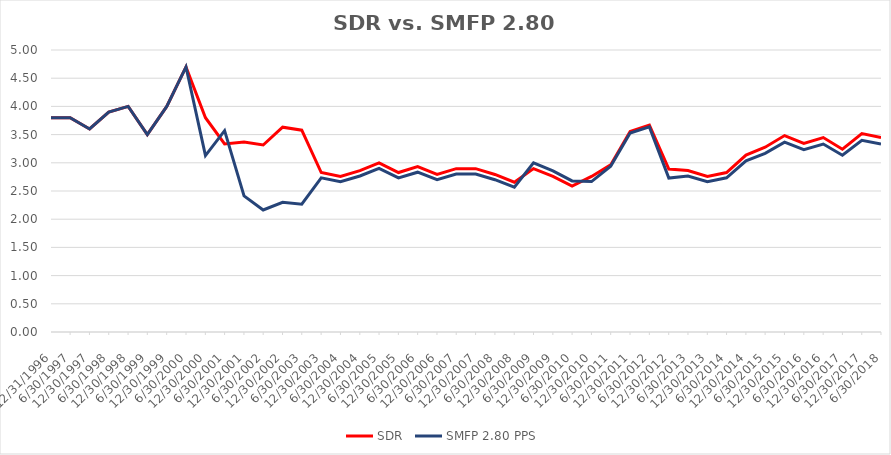
| Category | SDR | SMFP 2.80 PPS |
|---|---|---|
| 12/31/96 | 3.8 | 3.8 |
| 6/30/97 | 3.8 | 3.8 |
| 12/31/97 | 3.6 | 3.6 |
| 6/30/98 | 3.9 | 3.9 |
| 12/31/98 | 4 | 4 |
| 6/30/99 | 3.5 | 3.5 |
| 12/31/99 | 4 | 4 |
| 6/30/00 | 4.7 | 4.7 |
| 12/31/00 | 3.8 | 3.127 |
| 6/30/01 | 3.333 | 3.57 |
| 12/31/01 | 3.368 | 2.413 |
| 6/30/02 | 3.316 | 2.164 |
| 12/31/02 | 3.632 | 2.3 |
| 6/30/03 | 3.579 | 2.267 |
| 12/31/03 | 2.828 | 2.733 |
| 6/30/04 | 2.759 | 2.667 |
| 12/31/04 | 2.862 | 2.767 |
| 6/30/05 | 3 | 2.9 |
| 12/31/05 | 2.828 | 2.733 |
| 6/30/06 | 2.931 | 2.833 |
| 12/31/06 | 2.793 | 2.7 |
| 6/30/07 | 2.897 | 2.8 |
| 12/31/07 | 2.897 | 2.8 |
| 6/30/08 | 2.793 | 2.7 |
| 12/31/08 | 2.655 | 2.567 |
| 6/30/09 | 2.897 | 3 |
| 12/31/09 | 2.759 | 2.857 |
| 6/30/10 | 2.586 | 2.679 |
| 12/31/10 | 2.759 | 2.667 |
| 6/30/11 | 2.963 | 2.939 |
| 12/31/11 | 3.556 | 3.527 |
| 6/30/12 | 3.667 | 3.637 |
| 12/31/12 | 2.889 | 2.73 |
| 6/30/13 | 2.862 | 2.767 |
| 12/31/13 | 2.759 | 2.667 |
| 6/30/14 | 2.828 | 2.733 |
| 12/31/14 | 3.138 | 3.033 |
| 6/30/15 | 3.276 | 3.167 |
| 12/31/15 | 3.483 | 3.367 |
| 6/30/16 | 3.345 | 3.233 |
| 12/31/16 | 3.448 | 3.333 |
| 6/30/17 | 3.241 | 3.133 |
| 12/31/17 | 3.517 | 3.4 |
| 6/30/18 | 3.448 | 3.333 |